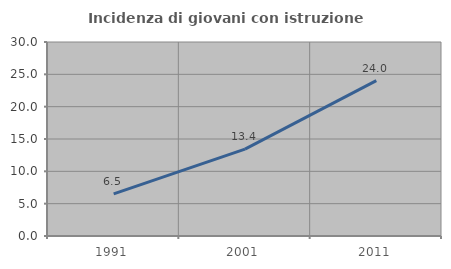
| Category | Incidenza di giovani con istruzione universitaria |
|---|---|
| 1991.0 | 6.52 |
| 2001.0 | 13.436 |
| 2011.0 | 24.035 |